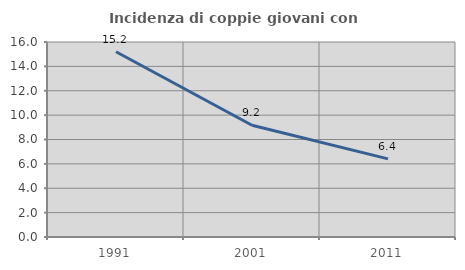
| Category | Incidenza di coppie giovani con figli |
|---|---|
| 1991.0 | 15.201 |
| 2001.0 | 9.17 |
| 2011.0 | 6.414 |